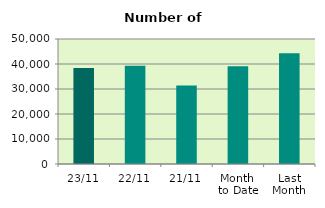
| Category | Series 0 |
|---|---|
| 23/11 | 38450 |
| 22/11 | 39300 |
| 21/11 | 31390 |
| Month 
to Date | 39055.412 |
| Last
Month | 44266.476 |